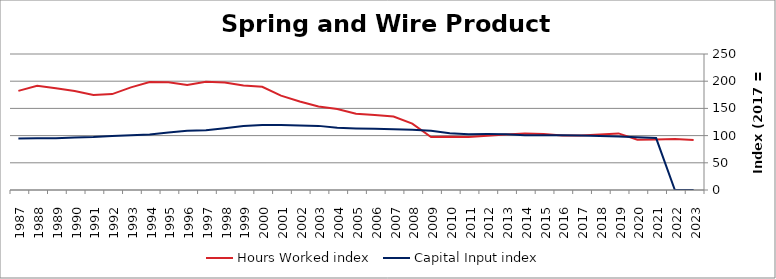
| Category | Hours Worked index | Capital Input index |
|---|---|---|
| 2023.0 | 92.012 | 0 |
| 2022.0 | 93.551 | 0 |
| 2021.0 | 92.684 | 95.494 |
| 2020.0 | 92.363 | 96.761 |
| 2019.0 | 104.062 | 98.127 |
| 2018.0 | 101.961 | 99.268 |
| 2017.0 | 100 | 100 |
| 2016.0 | 100.352 | 100.76 |
| 2015.0 | 102.82 | 100.793 |
| 2014.0 | 104.07 | 100.754 |
| 2013.0 | 102.228 | 102.268 |
| 2012.0 | 99.708 | 102.76 |
| 2011.0 | 97.267 | 102.656 |
| 2010.0 | 98.071 | 104.39 |
| 2009.0 | 97.455 | 108.946 |
| 2008.0 | 121.995 | 110.793 |
| 2007.0 | 135.182 | 111.704 |
| 2006.0 | 137.691 | 112.569 |
| 2005.0 | 140.043 | 113.221 |
| 2004.0 | 148.997 | 114.482 |
| 2003.0 | 153.347 | 117.87 |
| 2002.0 | 162.634 | 118.767 |
| 2001.0 | 173.465 | 119.616 |
| 2000.0 | 189.81 | 119.544 |
| 1999.0 | 192.197 | 117.436 |
| 1998.0 | 197.726 | 113.593 |
| 1997.0 | 198.949 | 109.67 |
| 1996.0 | 193.185 | 108.976 |
| 1995.0 | 198.053 | 105.684 |
| 1994.0 | 198.469 | 101.997 |
| 1993.0 | 188.622 | 100.627 |
| 1992.0 | 176.323 | 99.298 |
| 1991.0 | 174.731 | 97.502 |
| 1990.0 | 182.135 | 96.561 |
| 1989.0 | 187.235 | 95.328 |
| 1988.0 | 191.744 | 95.233 |
| 1987.0 | 182.221 | 94.856 |